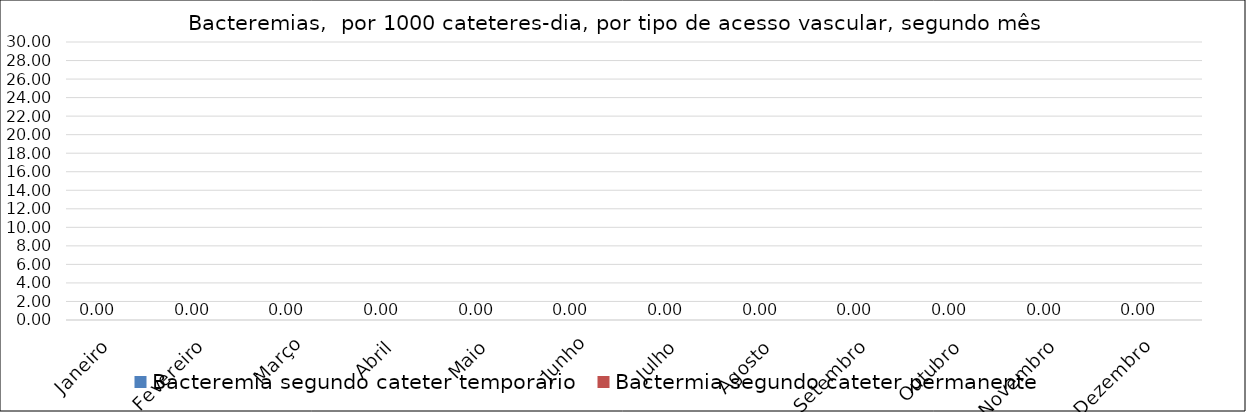
| Category | Bacteremia segundo cateter temporário | Bactermia segundo cateter permanente |
|---|---|---|
| Janeiro | 0 | 0 |
| Fevereiro | 0 | 0 |
| Março | 0 | 0 |
| Abril | 0 | 0 |
| Maio | 0 | 0 |
| Junho | 0 | 0 |
| Julho | 0 | 0 |
| Agosto | 0 | 0 |
| Setembro | 0 | 0 |
| Outubro | 0 | 0 |
| Novembro | 0 | 0 |
| Dezembro | 0 | 0 |